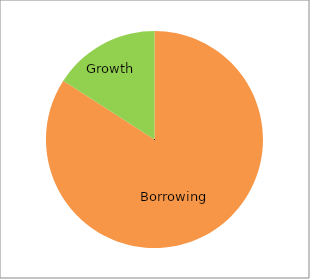
| Category | Series 0 |
|---|---|
| Borrowing | 188.8 |
| Growth | 35.7 |